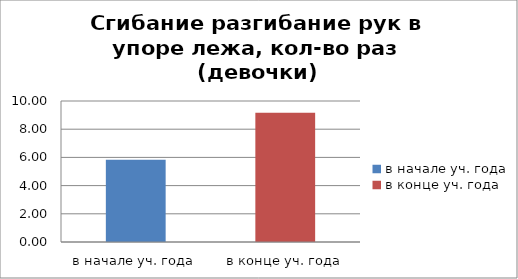
| Category | Series 0 |
|---|---|
| в начале уч. года | 5.833 |
| в конце уч. года | 9.167 |